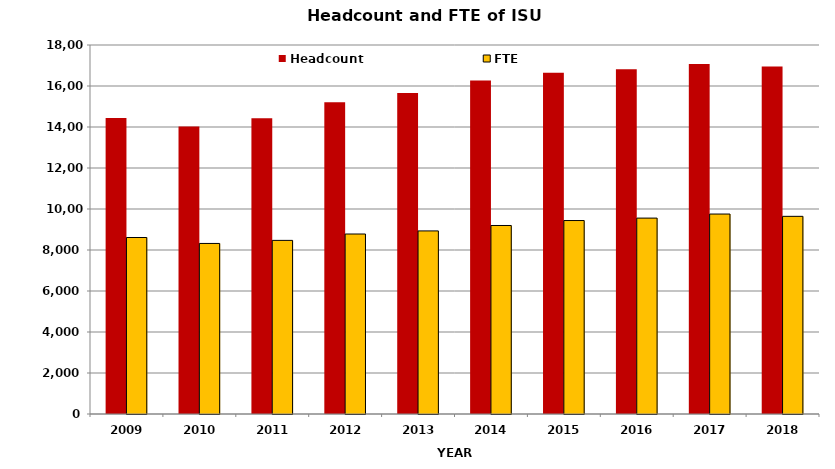
| Category | Headcount | FTE |
|---|---|---|
| 2009.0 | 14439 | 8609 |
| 2010.0 | 14020 | 8320 |
| 2011.0 | 14427 | 8469 |
| 2012.0 | 15211 | 8779.83 |
| 2013.0 | 15654 | 8930.87 |
| 2014.0 | 16268 | 9195.13 |
| 2015.0 | 16647 | 9437.01 |
| 2016.0 | 16811 | 9556 |
| 2017.0 | 17075 | 9754 |
| 2018.0 | 16952 | 9642 |